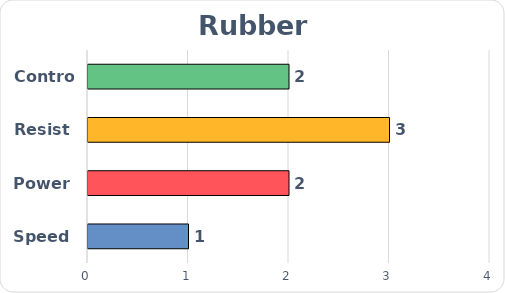
| Category | Series 0 |
|---|---|
| Speed | 1 |
| Power | 2 |
| Resist | 3 |
| Control | 2 |